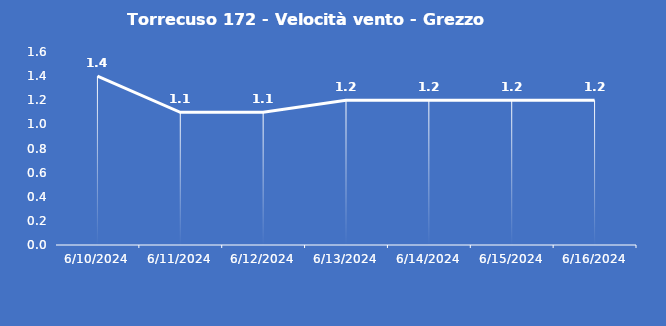
| Category | Torrecuso 172 - Velocità vento - Grezzo (m/s) |
|---|---|
| 6/10/24 | 1.4 |
| 6/11/24 | 1.1 |
| 6/12/24 | 1.1 |
| 6/13/24 | 1.2 |
| 6/14/24 | 1.2 |
| 6/15/24 | 1.2 |
| 6/16/24 | 1.2 |